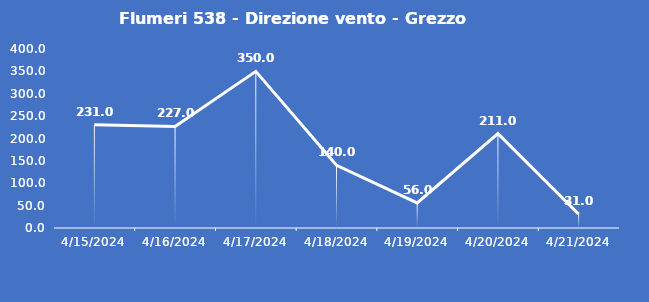
| Category | Flumeri 538 - Direzione vento - Grezzo (°N) |
|---|---|
| 4/15/24 | 231 |
| 4/16/24 | 227 |
| 4/17/24 | 350 |
| 4/18/24 | 140 |
| 4/19/24 | 56 |
| 4/20/24 | 211 |
| 4/21/24 | 31 |